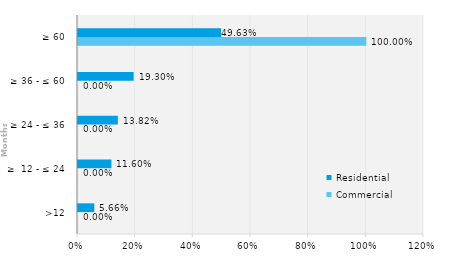
| Category | Commercial | Residential |
|---|---|---|
| >12 | 0 | 0.057 |
| ≥  12 - ≤ 24 | 0 | 0.116 |
| ≥ 24 - ≤ 36 | 0 | 0.138 |
| ≥ 36 - ≤ 60 | 0 | 0.193 |
| ≥ 60 | 1 | 0.496 |